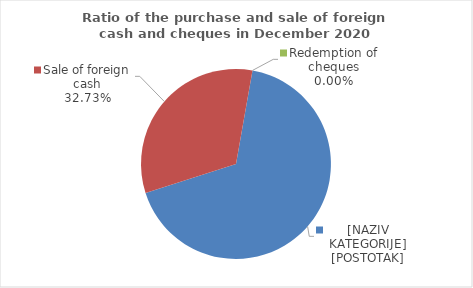
| Category | Series 0 |
|---|---|
| Purchase of foreign cash | 67.272 |
| Sale of foreign cash | 32.728 |
| Redemption of cheques | 0 |